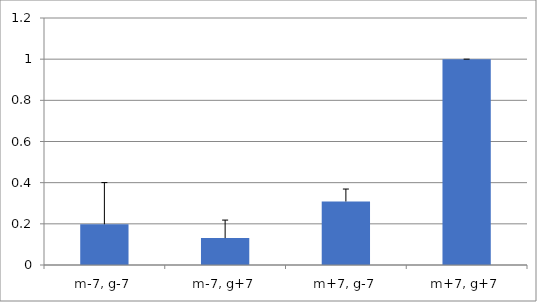
| Category | Series 0 |
|---|---|
| m-7, g-7 | 0.198 |
| m-7, g+7 | 0.131 |
| m+7, g-7 | 0.309 |
| m+7, g+7 | 1 |